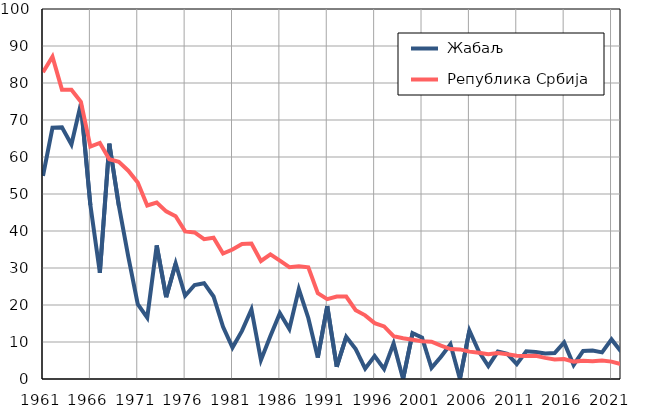
| Category |  Жабаљ |  Република Србија |
|---|---|---|
| 1961.0 | 54.9 | 82.9 |
| 1962.0 | 67.9 | 87.1 |
| 1963.0 | 68 | 78.2 |
| 1964.0 | 63.4 | 78.2 |
| 1965.0 | 74.4 | 74.9 |
| 1966.0 | 47 | 62.8 |
| 1967.0 | 28.7 | 63.8 |
| 1968.0 | 63.6 | 59.4 |
| 1969.0 | 46.9 | 58.7 |
| 1970.0 | 33.1 | 56.3 |
| 1971.0 | 20.2 | 53.1 |
| 1972.0 | 16.6 | 46.9 |
| 1973.0 | 36.1 | 47.7 |
| 1974.0 | 22.1 | 45.3 |
| 1975.0 | 31.2 | 44 |
| 1976.0 | 22.5 | 39.9 |
| 1977.0 | 25.4 | 39.6 |
| 1978.0 | 25.9 | 37.8 |
| 1979.0 | 22.3 | 38.2 |
| 1980.0 | 14.1 | 33.9 |
| 1981.0 | 8.5 | 35 |
| 1982.0 | 13 | 36.5 |
| 1983.0 | 18.8 | 36.6 |
| 1984.0 | 5.1 | 31.9 |
| 1985.0 | 11.6 | 33.7 |
| 1986.0 | 17.8 | 32 |
| 1987.0 | 13.5 | 30.2 |
| 1988.0 | 24.3 | 30.5 |
| 1989.0 | 16.5 | 30.2 |
| 1990.0 | 5.8 | 23.2 |
| 1991.0 | 19.7 | 21.6 |
| 1992.0 | 3.3 | 22.3 |
| 1993.0 | 11.4 | 22.3 |
| 1994.0 | 8.1 | 18.6 |
| 1995.0 | 2.8 | 17.2 |
| 1996.0 | 6.2 | 15.1 |
| 1997.0 | 2.7 | 14.2 |
| 1998.0 | 9.6 | 11.6 |
| 1999.0 | 0 | 11 |
| 2000.0 | 12.4 | 10.6 |
| 2001.0 | 11.2 | 10.2 |
| 2002.0 | 3 | 10.1 |
| 2003.0 | 6 | 9 |
| 2004.0 | 9.4 | 8.1 |
| 2005.0 | 0 | 8 |
| 2006.0 | 13.1 | 7.4 |
| 2007.0 | 7.4 | 7.1 |
| 2008.0 | 3.5 | 6.7 |
| 2009.0 | 7.4 | 7 |
| 2010.0 | 6.8 | 6.7 |
| 2011.0 | 4 | 6.3 |
| 2012.0 | 7.5 | 6.2 |
| 2013.0 | 7.3 | 6.3 |
| 2014.0 | 6.9 | 5.7 |
| 2015.0 | 7 | 5.3 |
| 2016.0 | 9.9 | 5.4 |
| 2017.0 | 3.8 | 4.7 |
| 2018.0 | 7.6 | 4.9 |
| 2019.0 | 7.7 | 4.8 |
| 2020.0 | 7.2 | 5 |
| 2021.0 | 10.7 | 4.7 |
| 2022.0 | 7.4 | 4 |